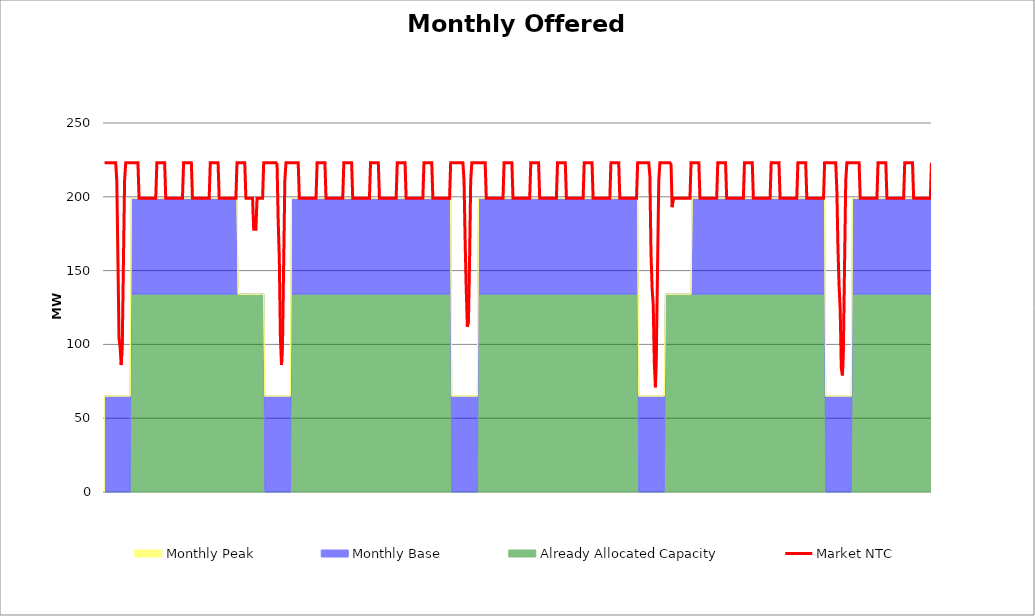
| Category | Market NTC |
|---|---|
| 0 | 223 |
| 1 | 223 |
| 2 | 223 |
| 3 | 223 |
| 4 | 223 |
| 5 | 223 |
| 6 | 223 |
| 7 | 223 |
| 8 | 223 |
| 9 | 223 |
| 10 | 223 |
| 11 | 211 |
| 12 | 158 |
| 13 | 104 |
| 14 | 98 |
| 15 | 86 |
| 16 | 104 |
| 17 | 158 |
| 18 | 211 |
| 19 | 223 |
| 20 | 223 |
| 21 | 223 |
| 22 | 223 |
| 23 | 223 |
| 24 | 223 |
| 25 | 223 |
| 26 | 223 |
| 27 | 223 |
| 28 | 223 |
| 29 | 223 |
| 30 | 223 |
| 31 | 199 |
| 32 | 199 |
| 33 | 199 |
| 34 | 199 |
| 35 | 199 |
| 36 | 199 |
| 37 | 199 |
| 38 | 199 |
| 39 | 199 |
| 40 | 199 |
| 41 | 199 |
| 42 | 199 |
| 43 | 199 |
| 44 | 199 |
| 45 | 199 |
| 46 | 199 |
| 47 | 223 |
| 48 | 223 |
| 49 | 223 |
| 50 | 223 |
| 51 | 223 |
| 52 | 223 |
| 53 | 223 |
| 54 | 223 |
| 55 | 199 |
| 56 | 199 |
| 57 | 199 |
| 58 | 199 |
| 59 | 199 |
| 60 | 199 |
| 61 | 199 |
| 62 | 199 |
| 63 | 199 |
| 64 | 199 |
| 65 | 199 |
| 66 | 199 |
| 67 | 199 |
| 68 | 199 |
| 69 | 199 |
| 70 | 199 |
| 71 | 223 |
| 72 | 223 |
| 73 | 223 |
| 74 | 223 |
| 75 | 223 |
| 76 | 223 |
| 77 | 223 |
| 78 | 223 |
| 79 | 199 |
| 80 | 199 |
| 81 | 199 |
| 82 | 199 |
| 83 | 199 |
| 84 | 199 |
| 85 | 199 |
| 86 | 199 |
| 87 | 199 |
| 88 | 199 |
| 89 | 199 |
| 90 | 199 |
| 91 | 199 |
| 92 | 199 |
| 93 | 199 |
| 94 | 199 |
| 95 | 223 |
| 96 | 223 |
| 97 | 223 |
| 98 | 223 |
| 99 | 223 |
| 100 | 223 |
| 101 | 223 |
| 102 | 223 |
| 103 | 199 |
| 104 | 199 |
| 105 | 199 |
| 106 | 199 |
| 107 | 199 |
| 108 | 199 |
| 109 | 199 |
| 110 | 199 |
| 111 | 199 |
| 112 | 199 |
| 113 | 199 |
| 114 | 199 |
| 115 | 199 |
| 116 | 199 |
| 117 | 199 |
| 118 | 199 |
| 119 | 223 |
| 120 | 223 |
| 121 | 223 |
| 122 | 223 |
| 123 | 223 |
| 124 | 223 |
| 125 | 223 |
| 126 | 223 |
| 127 | 199 |
| 128 | 199 |
| 129 | 199 |
| 130 | 199 |
| 131 | 199 |
| 132 | 199 |
| 133 | 199 |
| 134 | 178 |
| 135 | 178 |
| 136 | 178 |
| 137 | 199 |
| 138 | 199 |
| 139 | 199 |
| 140 | 199 |
| 141 | 199 |
| 142 | 199 |
| 143 | 223 |
| 144 | 223 |
| 145 | 223 |
| 146 | 223 |
| 147 | 223 |
| 148 | 223 |
| 149 | 223 |
| 150 | 223 |
| 151 | 223 |
| 152 | 223 |
| 153 | 223 |
| 154 | 223 |
| 155 | 222 |
| 156 | 184 |
| 157 | 159 |
| 158 | 105 |
| 159 | 86 |
| 160 | 105 |
| 161 | 158 |
| 162 | 211 |
| 163 | 223 |
| 164 | 223 |
| 165 | 223 |
| 166 | 223 |
| 167 | 223 |
| 168 | 223 |
| 169 | 223 |
| 170 | 223 |
| 171 | 223 |
| 172 | 223 |
| 173 | 223 |
| 174 | 223 |
| 175 | 199 |
| 176 | 199 |
| 177 | 199 |
| 178 | 199 |
| 179 | 199 |
| 180 | 199 |
| 181 | 199 |
| 182 | 199 |
| 183 | 199 |
| 184 | 199 |
| 185 | 199 |
| 186 | 199 |
| 187 | 199 |
| 188 | 199 |
| 189 | 199 |
| 190 | 199 |
| 191 | 223 |
| 192 | 223 |
| 193 | 223 |
| 194 | 223 |
| 195 | 223 |
| 196 | 223 |
| 197 | 223 |
| 198 | 223 |
| 199 | 199 |
| 200 | 199 |
| 201 | 199 |
| 202 | 199 |
| 203 | 199 |
| 204 | 199 |
| 205 | 199 |
| 206 | 199 |
| 207 | 199 |
| 208 | 199 |
| 209 | 199 |
| 210 | 199 |
| 211 | 199 |
| 212 | 199 |
| 213 | 199 |
| 214 | 199 |
| 215 | 223 |
| 216 | 223 |
| 217 | 223 |
| 218 | 223 |
| 219 | 223 |
| 220 | 223 |
| 221 | 223 |
| 222 | 223 |
| 223 | 199 |
| 224 | 199 |
| 225 | 199 |
| 226 | 199 |
| 227 | 199 |
| 228 | 199 |
| 229 | 199 |
| 230 | 199 |
| 231 | 199 |
| 232 | 199 |
| 233 | 199 |
| 234 | 199 |
| 235 | 199 |
| 236 | 199 |
| 237 | 199 |
| 238 | 199 |
| 239 | 223 |
| 240 | 223 |
| 241 | 223 |
| 242 | 223 |
| 243 | 223 |
| 244 | 223 |
| 245 | 223 |
| 246 | 223 |
| 247 | 199 |
| 248 | 199 |
| 249 | 199 |
| 250 | 199 |
| 251 | 199 |
| 252 | 199 |
| 253 | 199 |
| 254 | 199 |
| 255 | 199 |
| 256 | 199 |
| 257 | 199 |
| 258 | 199 |
| 259 | 199 |
| 260 | 199 |
| 261 | 199 |
| 262 | 199 |
| 263 | 223 |
| 264 | 223 |
| 265 | 223 |
| 266 | 223 |
| 267 | 223 |
| 268 | 223 |
| 269 | 223 |
| 270 | 223 |
| 271 | 199 |
| 272 | 199 |
| 273 | 199 |
| 274 | 199 |
| 275 | 199 |
| 276 | 199 |
| 277 | 199 |
| 278 | 199 |
| 279 | 199 |
| 280 | 199 |
| 281 | 199 |
| 282 | 199 |
| 283 | 199 |
| 284 | 199 |
| 285 | 199 |
| 286 | 199 |
| 287 | 223 |
| 288 | 223 |
| 289 | 223 |
| 290 | 223 |
| 291 | 223 |
| 292 | 223 |
| 293 | 223 |
| 294 | 223 |
| 295 | 199 |
| 296 | 199 |
| 297 | 199 |
| 298 | 199 |
| 299 | 199 |
| 300 | 199 |
| 301 | 199 |
| 302 | 199 |
| 303 | 199 |
| 304 | 199 |
| 305 | 199 |
| 306 | 199 |
| 307 | 199 |
| 308 | 199 |
| 309 | 199 |
| 310 | 199 |
| 311 | 223 |
| 312 | 223 |
| 313 | 223 |
| 314 | 223 |
| 315 | 223 |
| 316 | 223 |
| 317 | 223 |
| 318 | 223 |
| 319 | 223 |
| 320 | 223 |
| 321 | 223 |
| 322 | 223 |
| 323 | 211 |
| 324 | 170 |
| 325 | 137 |
| 326 | 112 |
| 327 | 116 |
| 328 | 158 |
| 329 | 211 |
| 330 | 223 |
| 331 | 223 |
| 332 | 223 |
| 333 | 223 |
| 334 | 223 |
| 335 | 223 |
| 336 | 223 |
| 337 | 223 |
| 338 | 223 |
| 339 | 223 |
| 340 | 223 |
| 341 | 223 |
| 342 | 223 |
| 343 | 199 |
| 344 | 199 |
| 345 | 199 |
| 346 | 199 |
| 347 | 199 |
| 348 | 199 |
| 349 | 199 |
| 350 | 199 |
| 351 | 199 |
| 352 | 199 |
| 353 | 199 |
| 354 | 199 |
| 355 | 199 |
| 356 | 199 |
| 357 | 199 |
| 358 | 199 |
| 359 | 223 |
| 360 | 223 |
| 361 | 223 |
| 362 | 223 |
| 363 | 223 |
| 364 | 223 |
| 365 | 223 |
| 366 | 223 |
| 367 | 199 |
| 368 | 199 |
| 369 | 199 |
| 370 | 199 |
| 371 | 199 |
| 372 | 199 |
| 373 | 199 |
| 374 | 199 |
| 375 | 199 |
| 376 | 199 |
| 377 | 199 |
| 378 | 199 |
| 379 | 199 |
| 380 | 199 |
| 381 | 199 |
| 382 | 199 |
| 383 | 223 |
| 384 | 223 |
| 385 | 223 |
| 386 | 223 |
| 387 | 223 |
| 388 | 223 |
| 389 | 223 |
| 390 | 223 |
| 391 | 199 |
| 392 | 199 |
| 393 | 199 |
| 394 | 199 |
| 395 | 199 |
| 396 | 199 |
| 397 | 199 |
| 398 | 199 |
| 399 | 199 |
| 400 | 199 |
| 401 | 199 |
| 402 | 199 |
| 403 | 199 |
| 404 | 199 |
| 405 | 199 |
| 406 | 199 |
| 407 | 223 |
| 408 | 223 |
| 409 | 223 |
| 410 | 223 |
| 411 | 223 |
| 412 | 223 |
| 413 | 223 |
| 414 | 223 |
| 415 | 199 |
| 416 | 199 |
| 417 | 199 |
| 418 | 199 |
| 419 | 199 |
| 420 | 199 |
| 421 | 199 |
| 422 | 199 |
| 423 | 199 |
| 424 | 199 |
| 425 | 199 |
| 426 | 199 |
| 427 | 199 |
| 428 | 199 |
| 429 | 199 |
| 430 | 199 |
| 431 | 223 |
| 432 | 223 |
| 433 | 223 |
| 434 | 223 |
| 435 | 223 |
| 436 | 223 |
| 437 | 223 |
| 438 | 223 |
| 439 | 199 |
| 440 | 199 |
| 441 | 199 |
| 442 | 199 |
| 443 | 199 |
| 444 | 199 |
| 445 | 199 |
| 446 | 199 |
| 447 | 199 |
| 448 | 199 |
| 449 | 199 |
| 450 | 199 |
| 451 | 199 |
| 452 | 199 |
| 453 | 199 |
| 454 | 199 |
| 455 | 223 |
| 456 | 223 |
| 457 | 223 |
| 458 | 223 |
| 459 | 223 |
| 460 | 223 |
| 461 | 223 |
| 462 | 223 |
| 463 | 199 |
| 464 | 199 |
| 465 | 199 |
| 466 | 199 |
| 467 | 199 |
| 468 | 199 |
| 469 | 199 |
| 470 | 199 |
| 471 | 199 |
| 472 | 199 |
| 473 | 199 |
| 474 | 199 |
| 475 | 199 |
| 476 | 199 |
| 477 | 199 |
| 478 | 199 |
| 479 | 223 |
| 480 | 223 |
| 481 | 223 |
| 482 | 223 |
| 483 | 223 |
| 484 | 223 |
| 485 | 223 |
| 486 | 223 |
| 487 | 223 |
| 488 | 223 |
| 489 | 223 |
| 490 | 214 |
| 491 | 162 |
| 492 | 138 |
| 493 | 127 |
| 494 | 87 |
| 495 | 71 |
| 496 | 104 |
| 497 | 158 |
| 498 | 211 |
| 499 | 223 |
| 500 | 223 |
| 501 | 223 |
| 502 | 223 |
| 503 | 223 |
| 504 | 223 |
| 505 | 223 |
| 506 | 223 |
| 507 | 223 |
| 508 | 223 |
| 509 | 222 |
| 510 | 193 |
| 511 | 199 |
| 512 | 199 |
| 513 | 199 |
| 514 | 199 |
| 515 | 199 |
| 516 | 199 |
| 517 | 199 |
| 518 | 199 |
| 519 | 199 |
| 520 | 199 |
| 521 | 199 |
| 522 | 199 |
| 523 | 199 |
| 524 | 199 |
| 525 | 199 |
| 526 | 199 |
| 527 | 223 |
| 528 | 223 |
| 529 | 223 |
| 530 | 223 |
| 531 | 223 |
| 532 | 223 |
| 533 | 223 |
| 534 | 223 |
| 535 | 199 |
| 536 | 199 |
| 537 | 199 |
| 538 | 199 |
| 539 | 199 |
| 540 | 199 |
| 541 | 199 |
| 542 | 199 |
| 543 | 199 |
| 544 | 199 |
| 545 | 199 |
| 546 | 199 |
| 547 | 199 |
| 548 | 199 |
| 549 | 199 |
| 550 | 199 |
| 551 | 223 |
| 552 | 223 |
| 553 | 223 |
| 554 | 223 |
| 555 | 223 |
| 556 | 223 |
| 557 | 223 |
| 558 | 223 |
| 559 | 199 |
| 560 | 199 |
| 561 | 199 |
| 562 | 199 |
| 563 | 199 |
| 564 | 199 |
| 565 | 199 |
| 566 | 199 |
| 567 | 199 |
| 568 | 199 |
| 569 | 199 |
| 570 | 199 |
| 571 | 199 |
| 572 | 199 |
| 573 | 199 |
| 574 | 199 |
| 575 | 223 |
| 576 | 223 |
| 577 | 223 |
| 578 | 223 |
| 579 | 223 |
| 580 | 223 |
| 581 | 223 |
| 582 | 223 |
| 583 | 199 |
| 584 | 199 |
| 585 | 199 |
| 586 | 199 |
| 587 | 199 |
| 588 | 199 |
| 589 | 199 |
| 590 | 199 |
| 591 | 199 |
| 592 | 199 |
| 593 | 199 |
| 594 | 199 |
| 595 | 199 |
| 596 | 199 |
| 597 | 199 |
| 598 | 199 |
| 599 | 223 |
| 600 | 223 |
| 601 | 223 |
| 602 | 223 |
| 603 | 223 |
| 604 | 223 |
| 605 | 223 |
| 606 | 223 |
| 607 | 199 |
| 608 | 199 |
| 609 | 199 |
| 610 | 199 |
| 611 | 199 |
| 612 | 199 |
| 613 | 199 |
| 614 | 199 |
| 615 | 199 |
| 616 | 199 |
| 617 | 199 |
| 618 | 199 |
| 619 | 199 |
| 620 | 199 |
| 621 | 199 |
| 622 | 199 |
| 623 | 223 |
| 624 | 223 |
| 625 | 223 |
| 626 | 223 |
| 627 | 223 |
| 628 | 223 |
| 629 | 223 |
| 630 | 223 |
| 631 | 199 |
| 632 | 199 |
| 633 | 199 |
| 634 | 199 |
| 635 | 199 |
| 636 | 199 |
| 637 | 199 |
| 638 | 199 |
| 639 | 199 |
| 640 | 199 |
| 641 | 199 |
| 642 | 199 |
| 643 | 199 |
| 644 | 199 |
| 645 | 199 |
| 646 | 199 |
| 647 | 223 |
| 648 | 223 |
| 649 | 223 |
| 650 | 223 |
| 651 | 223 |
| 652 | 223 |
| 653 | 223 |
| 654 | 223 |
| 655 | 223 |
| 656 | 223 |
| 657 | 223 |
| 658 | 205 |
| 659 | 165 |
| 660 | 140 |
| 661 | 124 |
| 662 | 84 |
| 663 | 79 |
| 664 | 104 |
| 665 | 158 |
| 666 | 211 |
| 667 | 223 |
| 668 | 223 |
| 669 | 223 |
| 670 | 223 |
| 671 | 223 |
| 672 | 223 |
| 673 | 223 |
| 674 | 223 |
| 675 | 223 |
| 676 | 223 |
| 677 | 223 |
| 678 | 223 |
| 679 | 199 |
| 680 | 199 |
| 681 | 199 |
| 682 | 199 |
| 683 | 199 |
| 684 | 199 |
| 685 | 199 |
| 686 | 199 |
| 687 | 199 |
| 688 | 199 |
| 689 | 199 |
| 690 | 199 |
| 691 | 199 |
| 692 | 199 |
| 693 | 199 |
| 694 | 199 |
| 695 | 223 |
| 696 | 223 |
| 697 | 223 |
| 698 | 223 |
| 699 | 223 |
| 700 | 223 |
| 701 | 223 |
| 702 | 223 |
| 703 | 199 |
| 704 | 199 |
| 705 | 199 |
| 706 | 199 |
| 707 | 199 |
| 708 | 199 |
| 709 | 199 |
| 710 | 199 |
| 711 | 199 |
| 712 | 199 |
| 713 | 199 |
| 714 | 199 |
| 715 | 199 |
| 716 | 199 |
| 717 | 199 |
| 718 | 199 |
| 719 | 223 |
| 720 | 223 |
| 721 | 223 |
| 722 | 223 |
| 723 | 223 |
| 724 | 223 |
| 725 | 223 |
| 726 | 223 |
| 727 | 199 |
| 728 | 199 |
| 729 | 199 |
| 730 | 199 |
| 731 | 199 |
| 732 | 199 |
| 733 | 199 |
| 734 | 199 |
| 735 | 199 |
| 736 | 199 |
| 737 | 199 |
| 738 | 199 |
| 739 | 199 |
| 740 | 199 |
| 741 | 199 |
| 742 | 199 |
| 743 | 223 |